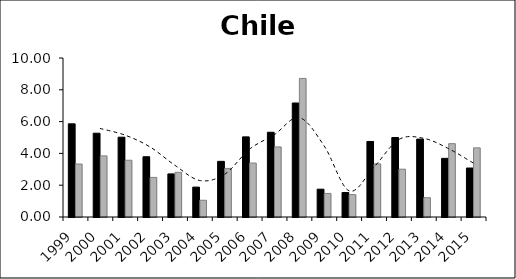
| Category | Series 0 | Series 1 |
|---|---|---|
| 1999.0 | 5.86 | 3.331 |
| 2000.0 | 5.27 | 3.844 |
| 2001.0 | 5.02 | 3.569 |
| 2002.0 | 3.79 | 2.489 |
| 2003.0 | 2.71 | 2.81 |
| 2004.0 | 1.88 | 1.052 |
| 2005.0 | 3.5 | 3.056 |
| 2006.0 | 5.04 | 3.392 |
| 2007.0 | 5.33 | 4.408 |
| 2008.0 | 7.17 | 8.716 |
| 2009.0 | 1.75 | 1.483 |
| 2010.0 | 1.54 | 1.411 |
| 2011.0 | 4.75 | 3.34 |
| 2012.0 | 5 | 3.006 |
| 2013.0 | 4.9 | 1.215 |
| 2014.0 | 3.69 | 4.613 |
| 2015.0 | 3.08 | 4.348 |